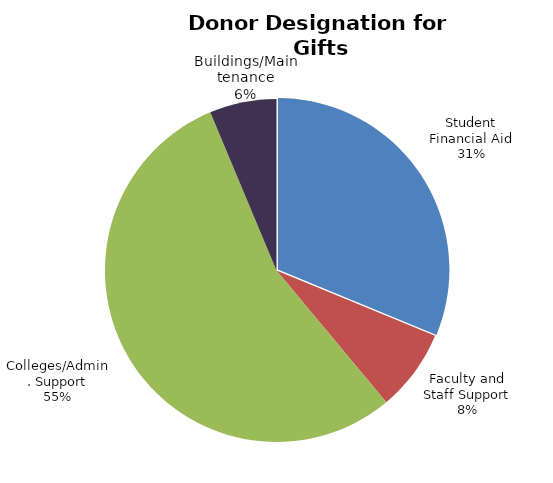
| Category | Series 0 |
|---|---|
| Student Financial Aid | 0.312 |
| Faculty and Staff Support | 0.077 |
| Colleges/Admin. Support | 0.547 |
| Buildings/Maintenance | 0.063 |